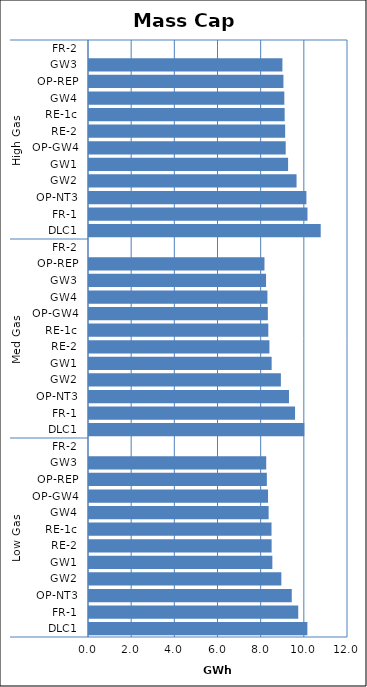
| Category | Mass Cap B |
|---|---|
| 0 | 10.118 |
| 1 | 9.694 |
| 2 | 9.394 |
| 3 | 8.911 |
| 4 | 8.495 |
| 5 | 8.462 |
| 6 | 8.457 |
| 7 | 8.323 |
| 8 | 8.296 |
| 9 | 8.241 |
| 10 | 8.212 |
| 11 | 0 |
| 12 | 9.977 |
| 13 | 9.547 |
| 14 | 9.266 |
| 15 | 8.891 |
| 16 | 8.463 |
| 17 | 8.359 |
| 18 | 8.307 |
| 19 | 8.287 |
| 20 | 8.267 |
| 21 | 8.203 |
| 22 | 8.13 |
| 23 | 0 |
| 24 | 10.736 |
| 25 | 10.122 |
| 26 | 10.073 |
| 27 | 9.617 |
| 28 | 9.224 |
| 29 | 9.114 |
| 30 | 9.089 |
| 31 | 9.066 |
| 32 | 9.05 |
| 33 | 9.008 |
| 34 | 8.961 |
| 35 | 0 |